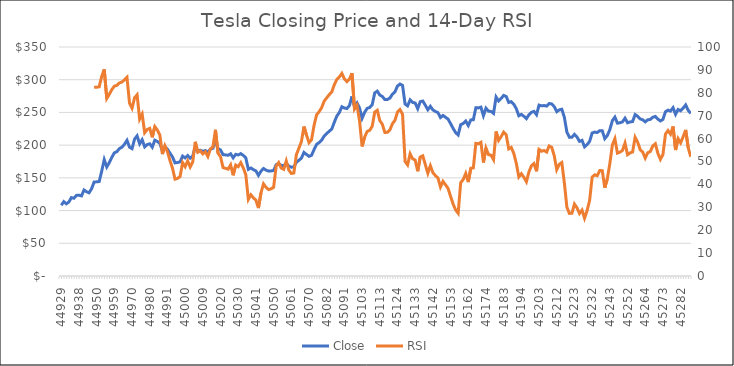
| Category | Close |
|---|---|
| 1/3/23 | 108.1 |
| 1/4/23 | 113.64 |
| 1/5/23 | 110.34 |
| 1/6/23 | 113.06 |
| 1/9/23 | 119.77 |
| 1/10/23 | 118.85 |
| 1/11/23 | 123.22 |
| 1/12/23 | 123.56 |
| 1/13/23 | 122.4 |
| 1/17/23 | 131.49 |
| 1/18/23 | 128.78 |
| 1/19/23 | 127.17 |
| 1/20/23 | 133.42 |
| 1/23/23 | 143.75 |
| 1/24/23 | 143.89 |
| 1/25/23 | 144.43 |
| 1/26/23 | 160.27 |
| 1/27/23 | 177.9 |
| 1/30/23 | 166.66 |
| 1/31/23 | 173.22 |
| 2/1/23 | 181.41 |
| 2/2/23 | 188.27 |
| 2/3/23 | 189.98 |
| 2/6/23 | 194.76 |
| 2/7/23 | 196.81 |
| 2/8/23 | 201.29 |
| 2/9/23 | 207.32 |
| 2/10/23 | 196.89 |
| 2/13/23 | 194.64 |
| 2/14/23 | 209.25 |
| 2/15/23 | 214.24 |
| 2/16/23 | 202.04 |
| 2/17/23 | 208.31 |
| 2/21/23 | 197.37 |
| 2/22/23 | 200.86 |
| 2/23/23 | 202.07 |
| 2/24/23 | 196.88 |
| 2/27/23 | 207.63 |
| 2/28/23 | 205.71 |
| 3/1/23 | 202.77 |
| 3/2/23 | 190.9 |
| 3/3/23 | 197.79 |
| 3/6/23 | 193.81 |
| 3/7/23 | 187.71 |
| 3/8/23 | 182 |
| 3/9/23 | 172.92 |
| 3/10/23 | 173.44 |
| 3/13/23 | 174.48 |
| 3/14/23 | 183.26 |
| 3/15/23 | 180.45 |
| 3/16/23 | 184.13 |
| 3/17/23 | 180.13 |
| 3/20/23 | 183.25 |
| 3/21/23 | 197.58 |
| 3/22/23 | 191.15 |
| 3/23/23 | 192.22 |
| 3/24/23 | 190.41 |
| 3/27/23 | 191.81 |
| 3/28/23 | 189.19 |
| 3/29/23 | 193.88 |
| 3/30/23 | 195.28 |
| 3/31/23 | 207.46 |
| 4/3/23 | 194.77 |
| 4/4/23 | 192.58 |
| 4/5/23 | 185.52 |
| 4/6/23 | 185.06 |
| 4/10/23 | 184.51 |
| 4/11/23 | 186.79 |
| 4/12/23 | 180.54 |
| 4/13/23 | 185.9 |
| 4/14/23 | 185 |
| 4/17/23 | 187.04 |
| 4/18/23 | 184.31 |
| 4/19/23 | 180.59 |
| 4/20/23 | 162.99 |
| 4/21/23 | 165.08 |
| 4/24/23 | 162.55 |
| 4/25/23 | 160.67 |
| 4/26/23 | 153.75 |
| 4/27/23 | 160.19 |
| 4/28/23 | 164.31 |
| 5/1/23 | 161.83 |
| 5/2/23 | 160.31 |
| 5/3/23 | 160.61 |
| 5/4/23 | 161.2 |
| 5/5/23 | 170.06 |
| 5/8/23 | 171.79 |
| 5/9/23 | 169.15 |
| 5/10/23 | 168.54 |
| 5/11/23 | 172.08 |
| 5/12/23 | 167.98 |
| 5/15/23 | 166.35 |
| 5/16/23 | 166.52 |
| 5/17/23 | 173.86 |
| 5/18/23 | 176.89 |
| 5/19/23 | 180.14 |
| 5/22/23 | 188.87 |
| 5/23/23 | 185.77 |
| 5/24/23 | 182.9 |
| 5/25/23 | 184.47 |
| 5/26/23 | 193.17 |
| 5/30/23 | 201.16 |
| 5/31/23 | 203.93 |
| 6/1/23 | 207.52 |
| 6/2/23 | 213.97 |
| 6/5/23 | 217.61 |
| 6/6/23 | 221.31 |
| 6/7/23 | 224.57 |
| 6/8/23 | 234.86 |
| 6/9/23 | 244.4 |
| 6/12/23 | 249.83 |
| 6/13/23 | 258.71 |
| 6/14/23 | 256.79 |
| 6/15/23 | 255.9 |
| 6/16/23 | 260.54 |
| 6/20/23 | 274.45 |
| 6/21/23 | 259.46 |
| 6/22/23 | 264.61 |
| 6/23/23 | 256.6 |
| 6/26/23 | 241.05 |
| 6/27/23 | 250.21 |
| 6/28/23 | 256.24 |
| 6/29/23 | 257.5 |
| 6/30/23 | 261.77 |
| 7/3/23 | 279.82 |
| 7/5/23 | 282.48 |
| 7/6/23 | 276.54 |
| 7/7/23 | 274.43 |
| 7/10/23 | 269.61 |
| 7/11/23 | 269.79 |
| 7/12/23 | 271.99 |
| 7/13/23 | 277.9 |
| 7/14/23 | 281.38 |
| 7/17/23 | 290.38 |
| 7/18/23 | 293.34 |
| 7/19/23 | 291.26 |
| 7/20/23 | 262.9 |
| 7/21/23 | 260.02 |
| 7/24/23 | 269.06 |
| 7/25/23 | 265.28 |
| 7/26/23 | 264.35 |
| 7/27/23 | 255.71 |
| 7/28/23 | 266.44 |
| 7/31/23 | 267.43 |
| 8/1/23 | 261.07 |
| 8/2/23 | 254.11 |
| 8/3/23 | 259.32 |
| 8/4/23 | 253.86 |
| 8/7/23 | 251.45 |
| 8/8/23 | 249.7 |
| 8/9/23 | 242.19 |
| 8/10/23 | 245.34 |
| 8/11/23 | 242.65 |
| 8/14/23 | 239.76 |
| 8/15/23 | 232.96 |
| 8/16/23 | 225.6 |
| 8/17/23 | 219.22 |
| 8/18/23 | 215.49 |
| 8/21/23 | 231.28 |
| 8/22/23 | 233.19 |
| 8/23/23 | 236.86 |
| 8/24/23 | 230.04 |
| 8/25/23 | 238.59 |
| 8/28/23 | 238.82 |
| 8/29/23 | 257.18 |
| 8/30/23 | 256.9 |
| 8/31/23 | 258.08 |
| 9/1/23 | 245.01 |
| 9/5/23 | 256.49 |
| 9/6/23 | 251.92 |
| 9/7/23 | 251.49 |
| 9/8/23 | 248.5 |
| 9/11/23 | 273.58 |
| 9/12/23 | 267.48 |
| 9/13/23 | 271.3 |
| 9/14/23 | 276.04 |
| 9/15/23 | 274.39 |
| 9/18/23 | 265.28 |
| 9/19/23 | 266.5 |
| 9/20/23 | 262.59 |
| 9/21/23 | 255.7 |
| 9/22/23 | 244.88 |
| 9/25/23 | 246.99 |
| 9/26/23 | 244.12 |
| 9/27/23 | 240.5 |
| 9/28/23 | 246.38 |
| 9/29/23 | 250.22 |
| 10/2/23 | 251.6 |
| 10/3/23 | 246.53 |
| 10/4/23 | 261.16 |
| 10/5/23 | 260.05 |
| 10/6/23 | 260.53 |
| 10/9/23 | 259.67 |
| 10/10/23 | 263.62 |
| 10/11/23 | 262.99 |
| 10/12/23 | 258.87 |
| 10/13/23 | 251.12 |
| 10/16/23 | 253.92 |
| 10/17/23 | 254.85 |
| 10/18/23 | 242.68 |
| 10/19/23 | 220.11 |
| 10/20/23 | 211.99 |
| 10/23/23 | 212.08 |
| 10/24/23 | 216.52 |
| 10/25/23 | 212.42 |
| 10/26/23 | 205.76 |
| 10/27/23 | 207.3 |
| 10/30/23 | 197.36 |
| 10/31/23 | 200.84 |
| 11/1/23 | 205.66 |
| 11/2/23 | 218.51 |
| 11/3/23 | 219.96 |
| 11/6/23 | 219.27 |
| 11/7/23 | 222.18 |
| 11/8/23 | 222.11 |
| 11/9/23 | 209.98 |
| 11/10/23 | 214.65 |
| 11/13/23 | 223.71 |
| 11/14/23 | 237.41 |
| 11/15/23 | 242.84 |
| 11/16/23 | 233.59 |
| 11/17/23 | 234.3 |
| 11/20/23 | 235.6 |
| 11/21/23 | 241.2 |
| 11/22/23 | 234.21 |
| 11/24/23 | 235.45 |
| 11/27/23 | 236.08 |
| 11/28/23 | 246.72 |
| 11/29/23 | 244.14 |
| 11/30/23 | 240.08 |
| 12/1/23 | 238.83 |
| 12/4/23 | 235.58 |
| 12/5/23 | 238.72 |
| 12/6/23 | 239.37 |
| 12/7/23 | 242.64 |
| 12/8/23 | 243.84 |
| 12/11/23 | 239.74 |
| 12/12/23 | 237.01 |
| 12/13/23 | 239.29 |
| 12/14/23 | 251.05 |
| 12/15/23 | 253.5 |
| 12/18/23 | 252.08 |
| 12/19/23 | 257.22 |
| 12/20/23 | 247.14 |
| 12/21/23 | 254.5 |
| 12/22/23 | 252.54 |
| 12/26/23 | 256.61 |
| 12/27/23 | 261.44 |
| 12/28/23 | 253.18 |
| 12/29/23 | 248.48 |